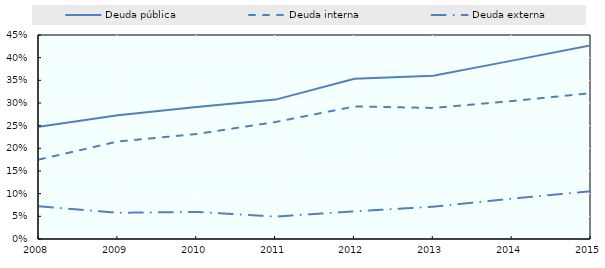
| Category | Deuda pública | Deuda interna | Deuda externa |
|---|---|---|---|
| 2008.0 | 0.247 | 0.175 | 0.072 |
| 2009.0 | 0.273 | 0.215 | 0.058 |
| 2010.0 | 0.291 | 0.232 | 0.06 |
| 2011.0 | 0.307 | 0.258 | 0.049 |
| 2012.0 | 0.353 | 0.292 | 0.061 |
| 2013.0 | 0.36 | 0.289 | 0.071 |
| 2014.0 | 0.393 | 0.304 | 0.089 |
| 2015.0 | 0.427 | 0.322 | 0.105 |